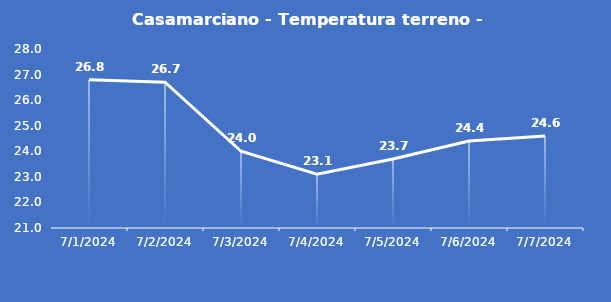
| Category | Casamarciano - Temperatura terreno - Grezzo (°C) |
|---|---|
| 7/1/24 | 26.8 |
| 7/2/24 | 26.7 |
| 7/3/24 | 24 |
| 7/4/24 | 23.1 |
| 7/5/24 | 23.7 |
| 7/6/24 | 24.4 |
| 7/7/24 | 24.6 |